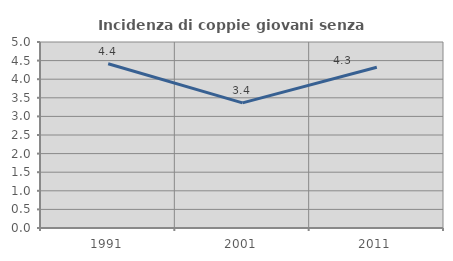
| Category | Incidenza di coppie giovani senza figli |
|---|---|
| 1991.0 | 4.416 |
| 2001.0 | 3.364 |
| 2011.0 | 4.323 |